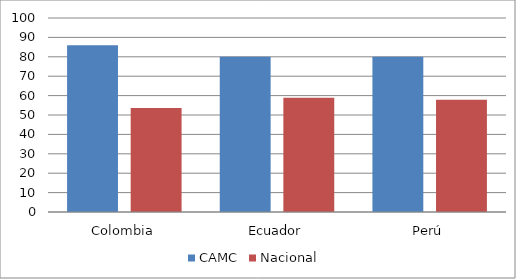
| Category | CAMC | Nacional  |
|---|---|---|
| Colombia | 86 | 53.57 |
| Ecuador | 80 | 58.951 |
| Perú | 80 | 57.799 |